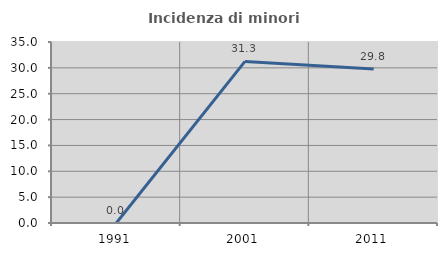
| Category | Incidenza di minori stranieri |
|---|---|
| 1991.0 | 0 |
| 2001.0 | 31.25 |
| 2011.0 | 29.787 |